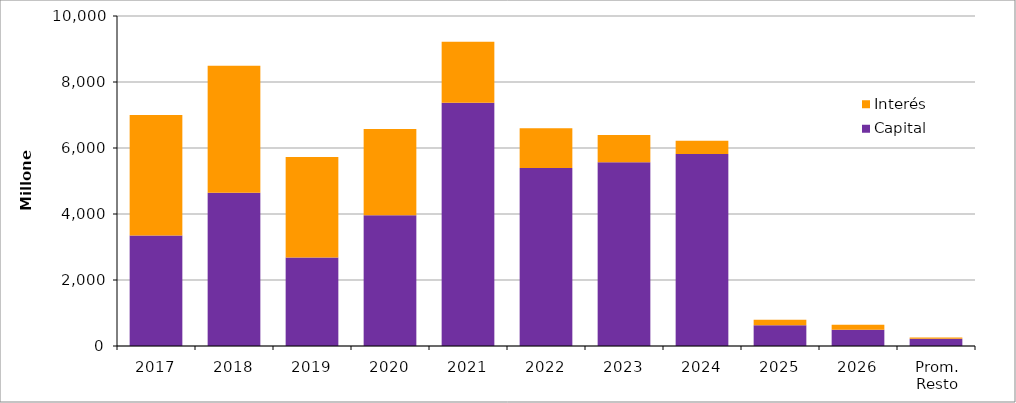
| Category | Capital | Interés |
|---|---|---|
| 2017 | 3348.983 | 3647.758 |
| 2018 | 4643.697 | 3848.543 |
| 2019 | 2685.386 | 3043.861 |
| 2020 | 3963.866 | 2614.279 |
| 2021 | 7373.648 | 1846.752 |
| 2022 | 5393.21 | 1208.982 |
| 2023 | 5565.314 | 825.75 |
| 2024 | 5817.146 | 401.305 |
| 2025 | 626.359 | 167.073 |
| 2026 | 494.93 | 149.532 |
| Prom. Resto | 218.654 | 36.768 |